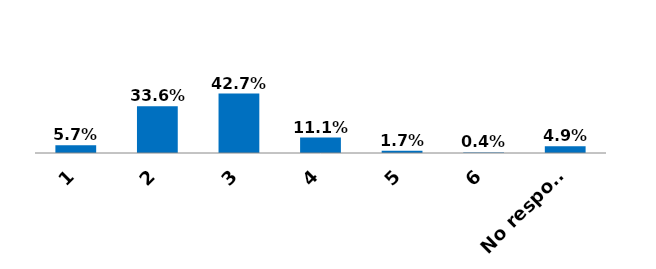
| Category | Series 0 |
|---|---|
| 1 | 0.057 |
| 2 | 0.336 |
| 3 | 0.427 |
| 4 | 0.111 |
| 5 | 0.017 |
| 6 | 0.004 |
| No responde | 0.049 |